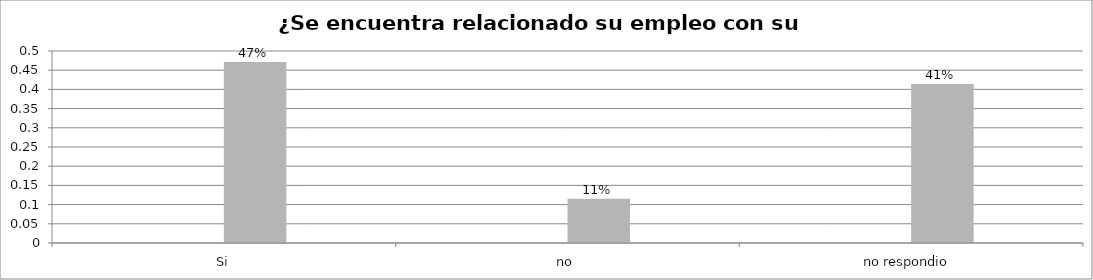
| Category | Series 0 | Series 1 | Series 2 | Series 3 |
|---|---|---|---|---|
| Si |  |  | 0.471 |  |
| no  |  |  | 0.115 |  |
| no respondio  |  |  | 0.414 |  |